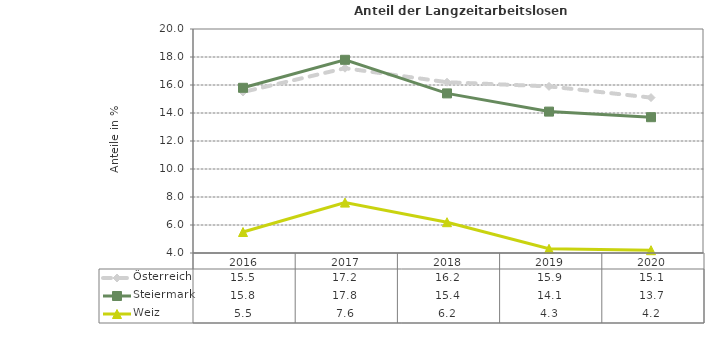
| Category | Österreich | Steiermark | Weiz |
|---|---|---|---|
| 2020.0 | 15.1 | 13.7 | 4.2 |
| 2019.0 | 15.9 | 14.1 | 4.3 |
| 2018.0 | 16.2 | 15.4 | 6.2 |
| 2017.0 | 17.2 | 17.8 | 7.6 |
| 2016.0 | 15.5 | 15.8 | 5.5 |